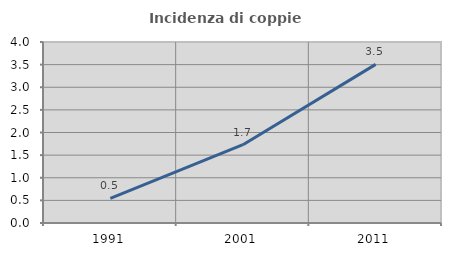
| Category | Incidenza di coppie miste |
|---|---|
| 1991.0 | 0.546 |
| 2001.0 | 1.73 |
| 2011.0 | 3.506 |